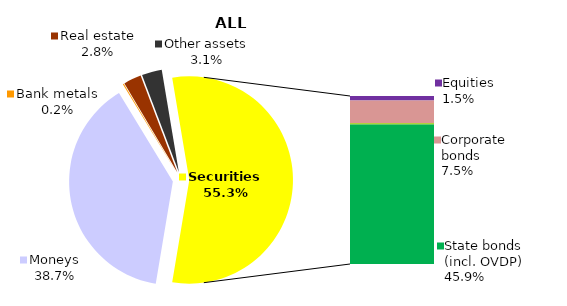
| Category | All NPF |
|---|---|
| Moneys | 1215.5 |
| Bank metals | 5 |
| Real estate | 86.8 |
| Other assets | 98.5 |
| Equities | 45.7 |
| Corporate bonds | 236.7 |
| Municipal bonds | 11.6 |
| State bonds (incl. OVDP) | 1443.5 |